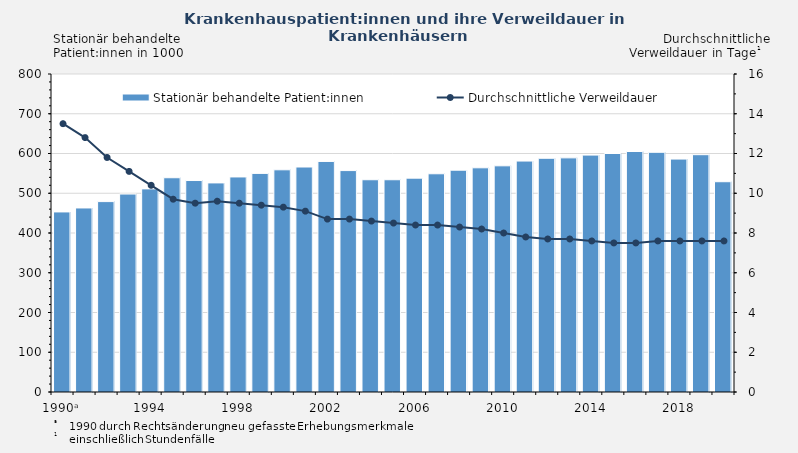
| Category | Stationär behandelte Patient:innen |
|---|---|
| 1990ᵃ | 453 |
| 1991 | 463 |
| 1992 | 479 |
| 1993 | 498 |
| 1994 | 511 |
| 1995 | 539 |
| 1996 | 532 |
| 1997 | 526 |
| 1998 | 541 |
| 1999 | 550 |
| 2000 | 559 |
| 2001 | 566 |
| 2002 | 580 |
| 2003 | 557 |
| 2004 | 534 |
| 2005 | 534 |
| 2006 | 538 |
| 2007 | 549 |
| 2008 | 558 |
| 2009 | 564 |
| 2010 | 569 |
| 2011 | 581 |
| 2012 | 588 |
| 2013 | 589 |
| 2014 | 596 |
| 2015 | 600 |
| 2016 | 605 |
| 2017 | 603 |
| 2018 | 586 |
| 2019 | 597 |
| 2020 | 529 |